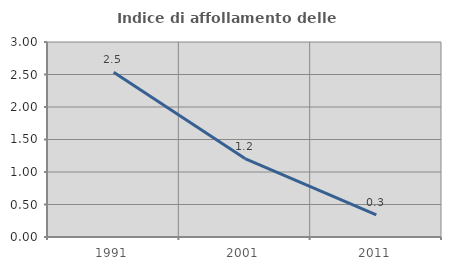
| Category | Indice di affollamento delle abitazioni  |
|---|---|
| 1991.0 | 2.535 |
| 2001.0 | 1.206 |
| 2011.0 | 0.339 |